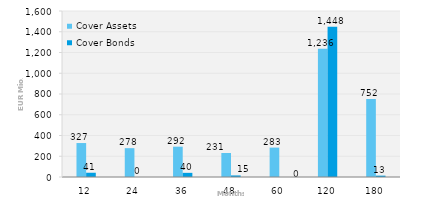
| Category | Cover Assets | Cover Bonds |
|---|---|---|
| 12.0 | 327.336 | 41 |
| 24.0 | 277.954 | 0 |
| 36.0 | 292.214 | 40 |
| 48.0 | 231.439 | 15 |
| 60.0 | 283.364 | 0 |
| 120.0 | 1235.837 | 1447.849 |
| 180.0 | 751.749 | 13 |